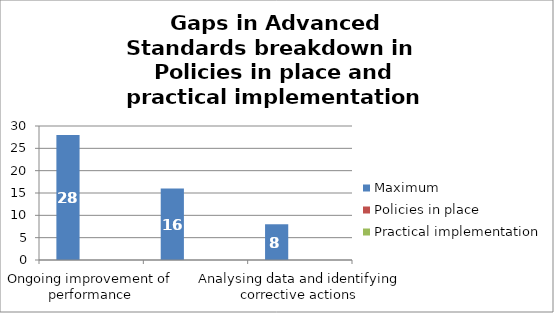
| Category | Maximum | Policies in place | Practical implementation |
|---|---|---|---|
| Ongoing improvement of performance | 28 | 0 | 0 |
| Controlling / Mitigating business risks | 16 | 0 | 0 |
| Analysing data and identifying corrective actions | 8 | 0 | 0 |